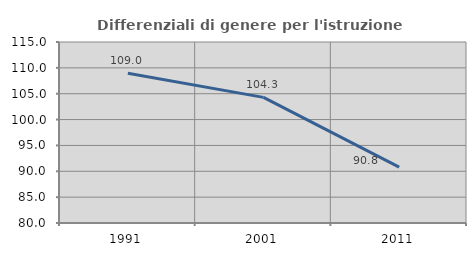
| Category | Differenziali di genere per l'istruzione superiore |
|---|---|
| 1991.0 | 108.972 |
| 2001.0 | 104.292 |
| 2011.0 | 90.817 |